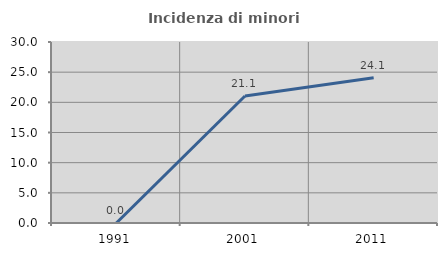
| Category | Incidenza di minori stranieri |
|---|---|
| 1991.0 | 0 |
| 2001.0 | 21.053 |
| 2011.0 | 24.074 |